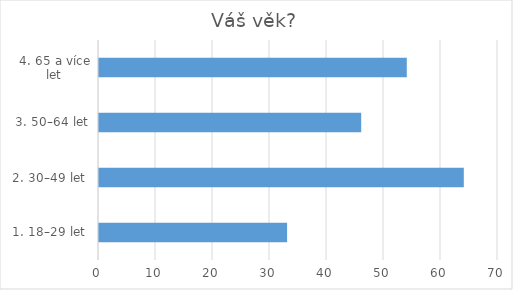
| Category | Series 0 |
|---|---|
| 1. 18–29 let  | 33 |
| 2. 30–49 let  | 64 |
| 3. 50–64 let | 46 |
| 4. 65 a více let | 54 |